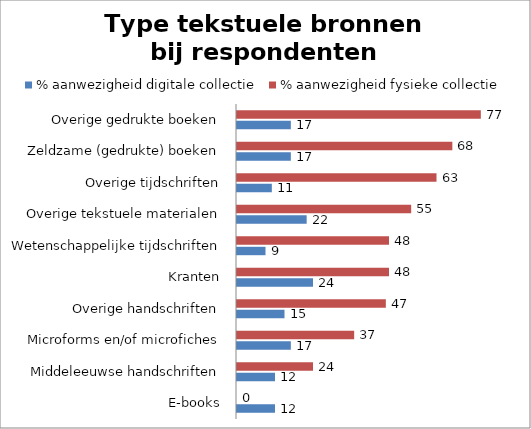
| Category | % aanwezigheid digitale collectie | % aanwezigheid fysieke collectie |
|---|---|---|
| E-books | 12 | 0 |
| Middeleeuwse handschriften | 12 | 24 |
| Microforms en/of microfiches | 17 | 37 |
| Overige handschriften | 15 | 47 |
| Kranten | 24 | 48 |
| Wetenschappelijke tijdschriften | 9 | 48 |
| Overige tekstuele materialen | 22 | 55 |
| Overige tijdschriften | 11 | 63 |
| Zeldzame (gedrukte) boeken | 17 | 68 |
| Overige gedrukte boeken | 17 | 77 |